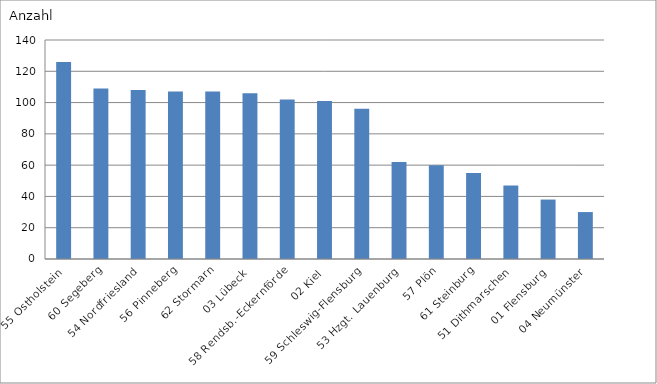
| Category | 55 Ostholstein |
|---|---|
| 55 Ostholstein | 126 |
| 60 Segeberg | 109 |
| 54 Nordfriesland | 108 |
| 56 Pinneberg | 107 |
| 62 Stormarn | 107 |
| 03 Lübeck | 106 |
| 58 Rendsb.-Eckernförde | 102 |
| 02 Kiel | 101 |
| 59 Schleswig-Flensburg | 96 |
| 53 Hzgt. Lauenburg | 62 |
| 57 Plön | 60 |
| 61 Steinburg | 55 |
| 51 Dithmarschen | 47 |
| 01 Flensburg | 38 |
| 04 Neumünster | 30 |